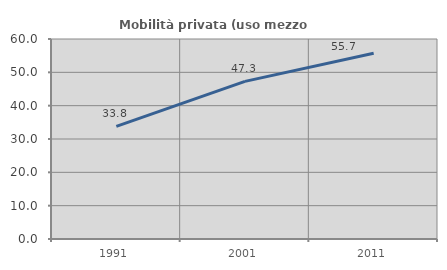
| Category | Mobilità privata (uso mezzo privato) |
|---|---|
| 1991.0 | 33.784 |
| 2001.0 | 47.296 |
| 2011.0 | 55.708 |